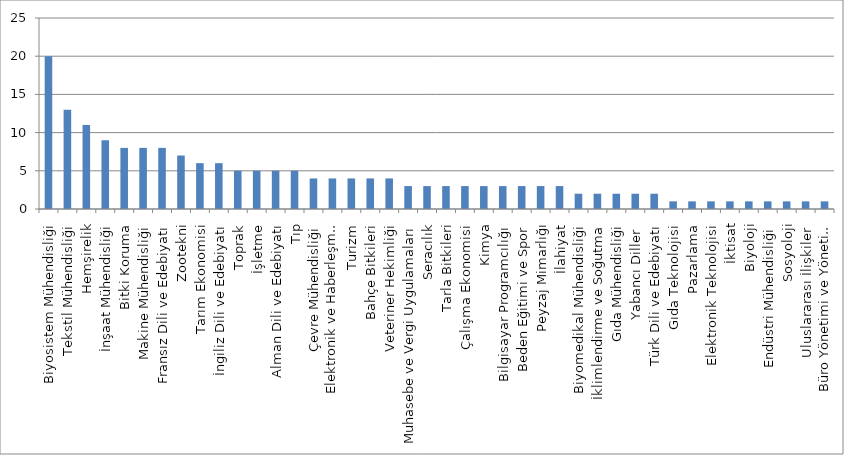
| Category | Series 0 |
|---|---|
| Biyosistem Mühendisliği | 20 |
| Tekstil Mühendisliği | 13 |
| Hemşirelik | 11 |
| İnşaat Mühendisliği | 9 |
| Bitki Koruma | 8 |
| Makine Mühendisliği | 8 |
| Fransız Dili ve Edebiyatı | 8 |
| Zootekni | 7 |
| Tarım Ekonomisi | 6 |
| İngiliz Dili ve Edebiyatı | 6 |
| Toprak | 5 |
| İşletme | 5 |
| Alman Dili ve Edebiyatı | 5 |
| Tıp | 5 |
| Çevre Mühendisliği | 4 |
| Elektronik ve Haberleşme Mühendisliği | 4 |
| Turizm | 4 |
| Bahçe Bitkileri | 4 |
| Veteriner Hekimliği | 4 |
| Muhasebe ve Vergi Uygulamaları | 3 |
| Seracılık | 3 |
| Tarla Bitkileri | 3 |
| Çalışma Ekonomisi | 3 |
| Kimya | 3 |
| Bilgisayar Programcılığı | 3 |
| Beden Eğitimi ve Spor | 3 |
| Peyzaj Mimarlığı | 3 |
| İlahiyat | 3 |
| Biyomedikal Mühendisliği | 2 |
| İklimlendirme ve Soğutma | 2 |
| Gıda Mühendisliği | 2 |
| Yabancı Diller  | 2 |
| Türk Dili ve Edebiyatı | 2 |
| Gıda Teknolojisi | 1 |
| Pazarlama | 1 |
| Elektronik Teknolojisi | 1 |
| İktisat | 1 |
| Biyoloji | 1 |
| Endüstri Mühendisliği | 1 |
| Sosyoloji | 1 |
| Uluslararası İlişkiler  | 1 |
| Büro Yönetimi ve Yönetici Asistanlığı | 1 |